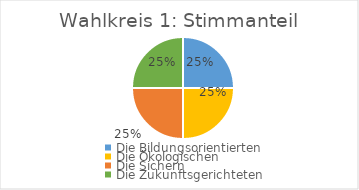
| Category | Stimmanteil |
|---|---|
| Die Bildungsorientierten | 0.25 |
| Die Ökologischen | 0.25 |
| Die Sichern | 0.25 |
| Die Zukunftsgerichteten | 0.25 |